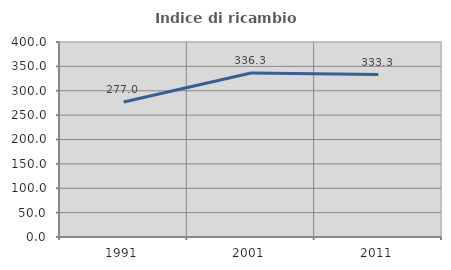
| Category | Indice di ricambio occupazionale  |
|---|---|
| 1991.0 | 277.027 |
| 2001.0 | 336.301 |
| 2011.0 | 333.333 |